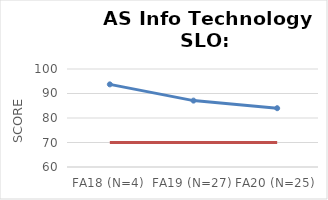
| Category | Series 0 | Series 1 |
|---|---|---|
| FA18 (N=4) | 93.73 | 70 |
| FA19 (N=27) | 87.1 | 70 |
| FA20 (N=25) | 84 | 70 |